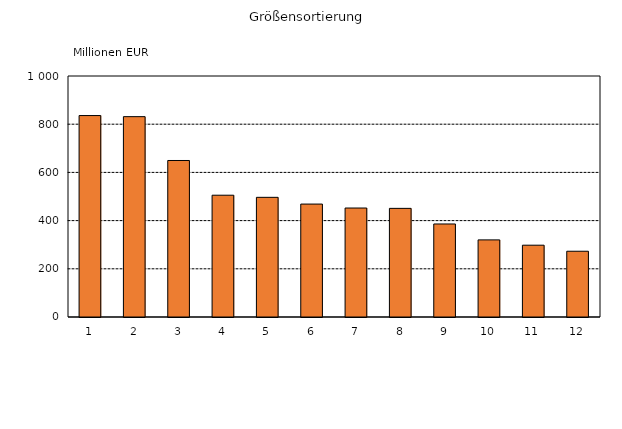
| Category | Series 0 |
|---|---|
| 1 | 835.854 |
| 2 | 831.366 |
| 3 | 649.394 |
| 4 | 505.317 |
| 5 | 496.558 |
| 6 | 468.572 |
| 7 | 452.172 |
| 8 | 450.783 |
| 9 | 386.001 |
| 10 | 319.99 |
| 11 | 297.972 |
| 12 | 272.882 |